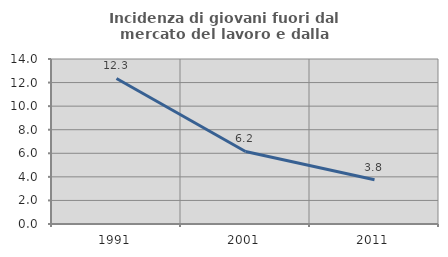
| Category | Incidenza di giovani fuori dal mercato del lavoro e dalla formazione  |
|---|---|
| 1991.0 | 12.346 |
| 2001.0 | 6.154 |
| 2011.0 | 3.759 |